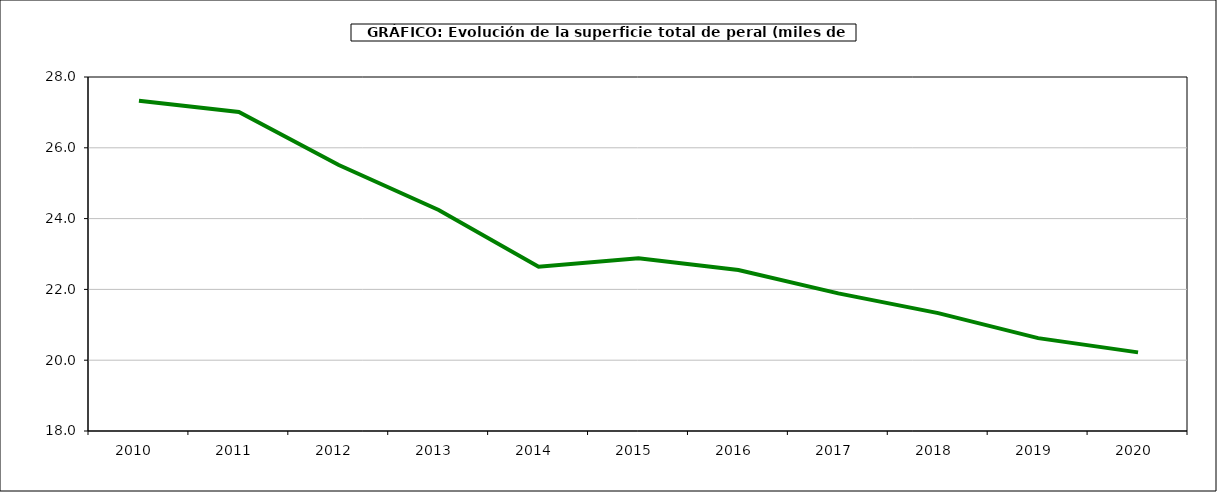
| Category | superficie peral |
|---|---|
| 2010.0 | 27.331 |
| 2011.0 | 27.01 |
| 2012.0 | 25.512 |
| 2013.0 | 24.243 |
| 2014.0 | 22.643 |
| 2015.0 | 22.878 |
| 2016.0 | 22.547 |
| 2017.0 | 21.888 |
| 2018.0 | 21.329 |
| 2019.0 | 20.623 |
| 2020.0 | 20.221 |